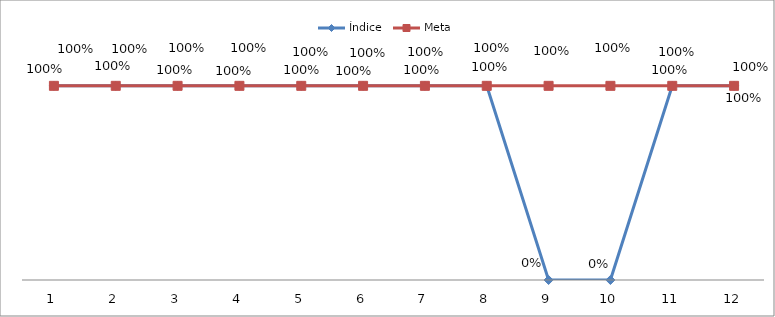
| Category | Índice | Meta |
|---|---|---|
| 0 | 1 | 1 |
| 1 | 1 | 1 |
| 2 | 1 | 1 |
| 3 | 1 | 1 |
| 4 | 1 | 1 |
| 5 | 1 | 1 |
| 6 | 1 | 1 |
| 7 | 1 | 1 |
| 8 | 0 | 1 |
| 9 | 0 | 1 |
| 10 | 1 | 1 |
| 11 | 1 | 1 |